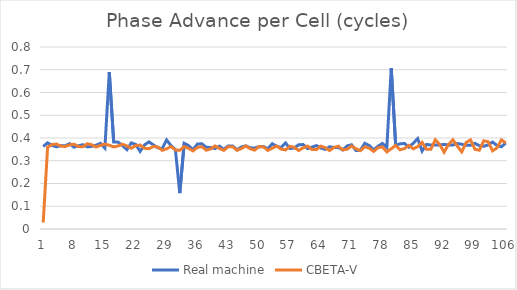
| Category | Real machine | CBETA-V |
|---|---|---|
| 0 | 0.363 | 0.028 |
| 1 | 0.379 | 0.36 |
| 2 | 0.367 | 0.371 |
| 3 | 0.361 | 0.373 |
| 4 | 0.367 | 0.364 |
| 5 | 0.366 | 0.363 |
| 6 | 0.375 | 0.37 |
| 7 | 0.36 | 0.373 |
| 8 | 0.366 | 0.362 |
| 9 | 0.37 | 0.362 |
| 10 | 0.361 | 0.375 |
| 11 | 0.363 | 0.37 |
| 12 | 0.368 | 0.36 |
| 13 | 0.377 | 0.368 |
| 14 | 0.356 | 0.373 |
| 15 | 0.689 | 0.368 |
| 16 | 0.382 | 0.361 |
| 17 | 0.382 | 0.365 |
| 18 | 0.367 | 0.373 |
| 19 | 0.349 | 0.365 |
| 20 | 0.379 | 0.355 |
| 21 | 0.372 | 0.367 |
| 22 | 0.341 | 0.369 |
| 23 | 0.37 | 0.355 |
| 24 | 0.383 | 0.353 |
| 25 | 0.37 | 0.363 |
| 26 | 0.357 | 0.361 |
| 27 | 0.353 | 0.346 |
| 28 | 0.392 | 0.353 |
| 29 | 0.367 | 0.363 |
| 30 | 0.349 | 0.348 |
| 31 | 0.158 | 0.346 |
| 32 | 0.377 | 0.362 |
| 33 | 0.367 | 0.354 |
| 34 | 0.349 | 0.343 |
| 35 | 0.374 | 0.359 |
| 36 | 0.375 | 0.362 |
| 37 | 0.359 | 0.346 |
| 38 | 0.358 | 0.352 |
| 39 | 0.354 | 0.365 |
| 40 | 0.364 | 0.354 |
| 41 | 0.35 | 0.346 |
| 42 | 0.365 | 0.361 |
| 43 | 0.365 | 0.362 |
| 44 | 0.348 | 0.346 |
| 45 | 0.361 | 0.354 |
| 46 | 0.365 | 0.365 |
| 47 | 0.357 | 0.352 |
| 48 | 0.356 | 0.347 |
| 49 | 0.362 | 0.363 |
| 50 | 0.362 | 0.361 |
| 51 | 0.353 | 0.345 |
| 52 | 0.375 | 0.355 |
| 53 | 0.363 | 0.365 |
| 54 | 0.358 | 0.351 |
| 55 | 0.378 | 0.348 |
| 56 | 0.354 | 0.364 |
| 57 | 0.356 | 0.359 |
| 58 | 0.37 | 0.345 |
| 59 | 0.371 | 0.357 |
| 60 | 0.353 | 0.365 |
| 61 | 0.36 | 0.349 |
| 62 | 0.367 | 0.349 |
| 63 | 0.356 | 0.364 |
| 64 | 0.35 | 0.358 |
| 65 | 0.361 | 0.345 |
| 66 | 0.359 | 0.358 |
| 67 | 0.359 | 0.364 |
| 68 | 0.348 | 0.348 |
| 69 | 0.365 | 0.351 |
| 70 | 0.37 | 0.365 |
| 71 | 0.345 | 0.352 |
| 72 | 0.346 | 0.345 |
| 73 | 0.377 | 0.361 |
| 74 | 0.367 | 0.355 |
| 75 | 0.348 | 0.341 |
| 76 | 0.364 | 0.357 |
| 77 | 0.376 | 0.361 |
| 78 | 0.359 | 0.339 |
| 79 | 0.707 | 0.353 |
| 80 | 0.369 | 0.367 |
| 81 | 0.374 | 0.348 |
| 82 | 0.376 | 0.354 |
| 83 | 0.36 | 0.368 |
| 84 | 0.377 | 0.352 |
| 85 | 0.397 | 0.362 |
| 86 | 0.342 | 0.381 |
| 87 | 0.372 | 0.35 |
| 88 | 0.369 | 0.351 |
| 89 | 0.37 | 0.392 |
| 90 | 0.37 | 0.372 |
| 91 | 0.372 | 0.338 |
| 92 | 0.37 | 0.371 |
| 93 | 0.37 | 0.392 |
| 94 | 0.376 | 0.364 |
| 95 | 0.373 | 0.339 |
| 96 | 0.368 | 0.381 |
| 97 | 0.368 | 0.392 |
| 98 | 0.377 | 0.351 |
| 99 | 0.366 | 0.346 |
| 100 | 0.364 | 0.388 |
| 101 | 0.37 | 0.383 |
| 102 | 0.382 | 0.344 |
| 103 | 0.367 | 0.356 |
| 104 | 0.361 | 0.392 |
| 105 | 0.378 | 0.378 |